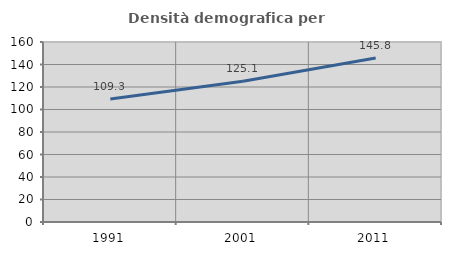
| Category | Densità demografica |
|---|---|
| 1991.0 | 109.322 |
| 2001.0 | 125.109 |
| 2011.0 | 145.828 |